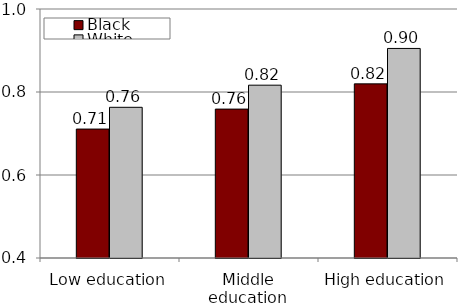
| Category | Black | White |
|---|---|---|
| Low education | 0.711 | 0.763 |
| Middle education | 0.759 | 0.816 |
| High education | 0.82 | 0.905 |